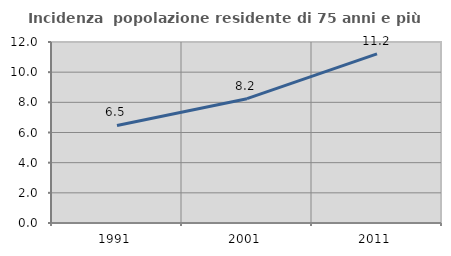
| Category | Incidenza  popolazione residente di 75 anni e più |
|---|---|
| 1991.0 | 6.466 |
| 2001.0 | 8.243 |
| 2011.0 | 11.217 |